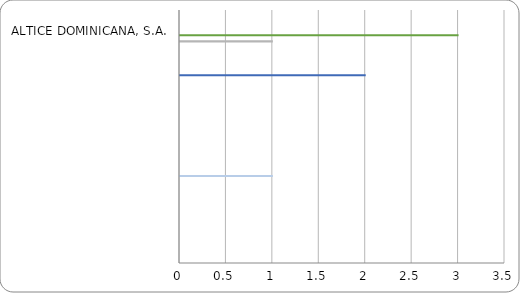
| Category | Series 0 | Series 1 | Series 2 | Series 3 | Series 4 | Series 5 | Series 6 | Series 7 | Series 8 | Series 9 | Series 10 | Series 11 | Series 12 | Series 13 | Series 14 | Series 15 | Series 16 | Series 17 | Series 18 |
|---|---|---|---|---|---|---|---|---|---|---|---|---|---|---|---|---|---|---|---|
| ALTICE DOMINICANA, S.A. | 0 | 0 | 0 | 0 | 0 | 0 | 0 | 0 | 0 | 0 | 0 | 3 | 0 | 0 | 1 | 0 | 0 | 0 | 0 |